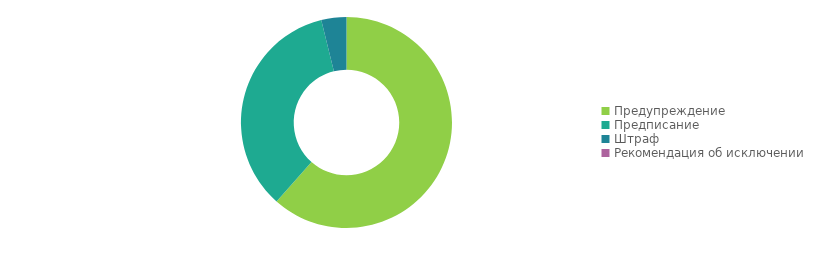
| Category | Series 0 |
|---|---|
| Предупреждение | 16 |
| Предписание | 9 |
| Штраф | 1 |
| Рекомендация об исключении | 0 |